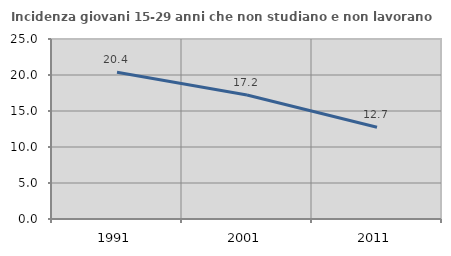
| Category | Incidenza giovani 15-29 anni che non studiano e non lavorano  |
|---|---|
| 1991.0 | 20.38 |
| 2001.0 | 17.225 |
| 2011.0 | 12.745 |